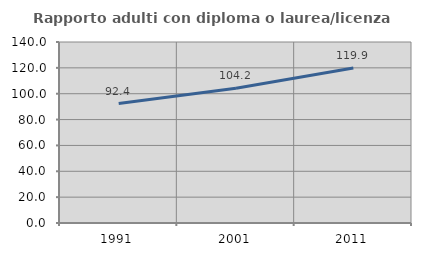
| Category | Rapporto adulti con diploma o laurea/licenza media  |
|---|---|
| 1991.0 | 92.394 |
| 2001.0 | 104.224 |
| 2011.0 | 119.919 |